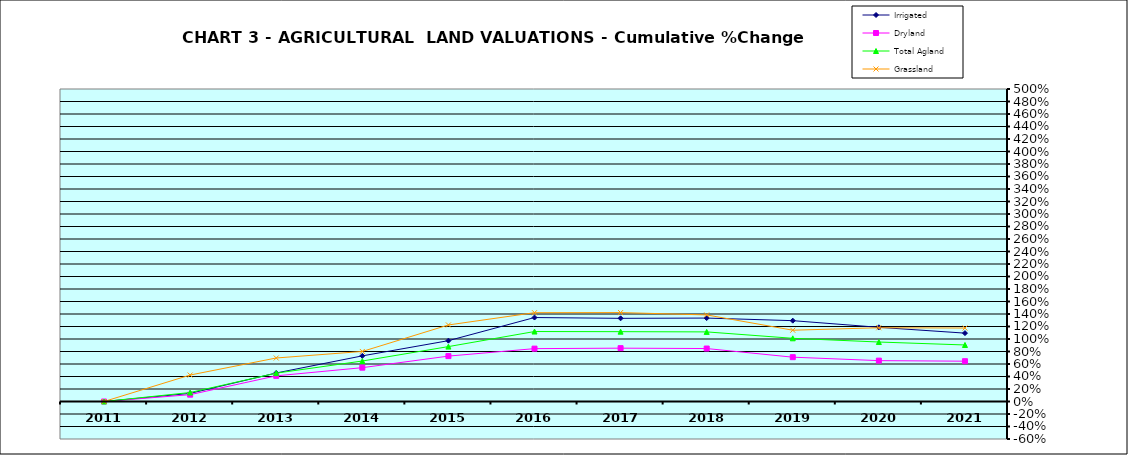
| Category | Irrigated | Dryland | Total Agland | Grassland |
|---|---|---|---|---|
| 2011.0 | 0 | 0 | 0 | 0 |
| 2012.0 | 0.13 | 0.109 | 0.144 | 0.423 |
| 2013.0 | 0.456 | 0.41 | 0.454 | 0.696 |
| 2014.0 | 0.73 | 0.541 | 0.648 | 0.801 |
| 2015.0 | 0.973 | 0.726 | 0.878 | 1.225 |
| 2016.0 | 1.343 | 0.846 | 1.119 | 1.421 |
| 2017.0 | 1.331 | 0.853 | 1.117 | 1.423 |
| 2018.0 | 1.335 | 0.847 | 1.114 | 1.385 |
| 2019.0 | 1.293 | 0.709 | 1.011 | 1.141 |
| 2020.0 | 1.187 | 0.654 | 0.952 | 1.18 |
| 2021.0 | 1.094 | 0.645 | 0.904 | 1.175 |